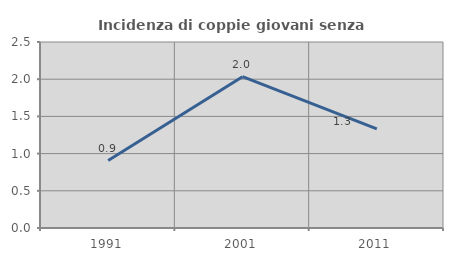
| Category | Incidenza di coppie giovani senza figli |
|---|---|
| 1991.0 | 0.906 |
| 2001.0 | 2.034 |
| 2011.0 | 1.333 |